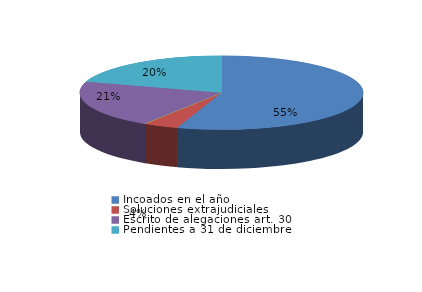
| Category | Series 0 |
|---|---|
| Incoados en el año | 109 |
| Soluciones extrajudiciales | 8 |
| Sobreseimiento del art. 27.4 | 0 |
| Escrito de alegaciones art. 30 | 41 |
| Pendientes a 31 de diciembre | 40 |